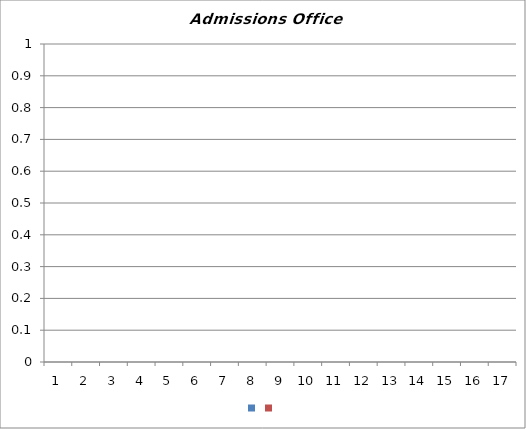
| Category | #REF! |
|---|---|
| 0 | 0 |
| 1 | 0 |
| 2 | 0 |
| 3 | 0 |
| 4 | 0 |
| 5 | 0 |
| 6 | 0 |
| 7 | 0 |
| 8 | 0 |
| 9 | 0 |
| 10 | 0 |
| 11 | 0 |
| 12 | 0 |
| 13 | 0 |
| 14 | 0 |
| 15 | 0 |
| 16 | 0 |